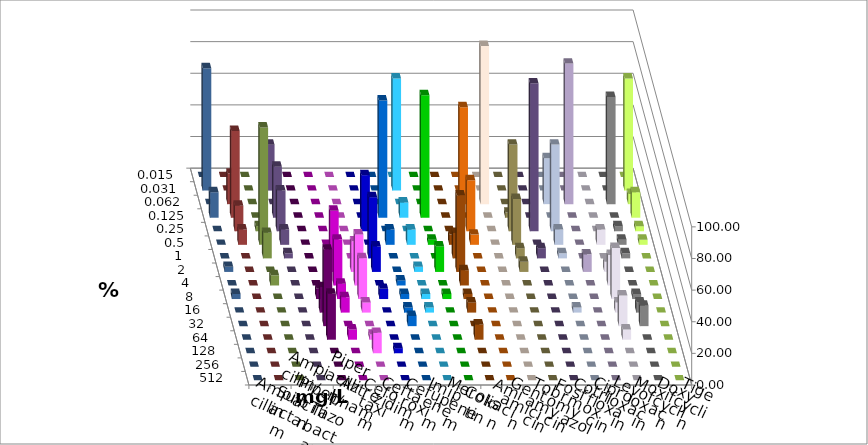
| Category | Ampicillin | Ampicillin/ Sulbactam | Piperacillin | Piperacillin/ Tazobactam | Aztreonam | Cefotaxim | Ceftazidim | Cefuroxim | Imipenem | Meropenem | Colistin | Amikacin | Gentamicin | Tobramycin | Fosfomycin | Cotrimoxazol | Ciprofloxacin | Levofloxacin | Moxifloxacin | Doxycyclin | Tigecyclin |
|---|---|---|---|---|---|---|---|---|---|---|---|---|---|---|---|---|---|---|---|---|---|
| 0.015 | 0 | 0 | 0 | 0 | 0 | 0 | 0 | 0 | 0 | 0 | 0 | 0 | 0 | 0 | 0 | 0 | 0 | 0 | 0 | 0 | 0 |
| 0.031 | 0 | 0 | 0 | 0 | 0 | 70.968 | 0 | 0 | 0 | 0 | 0 | 0 | 0 | 0 | 0 | 0 | 70.968 | 77.419 | 0 | 0 | 29.032 |
| 0.062 | 0 | 0 | 0 | 0 | 0 | 0 | 0 | 0 | 61.29 | 100 | 0 | 0 | 29.032 | 88.889 | 0 | 67.742 | 6.452 | 0 | 19.355 | 0 | 0 |
| 0.125 | 0 | 0 | 0 | 0 | 74.194 | 9.677 | 77.419 | 0 | 0 | 0 | 3.226 | 0 | 0 | 0 | 0 | 0 | 16.129 | 16.129 | 54.839 | 0 | 32.258 |
| 0.25 | 0 | 0 | 0 | 35.484 | 0 | 0 | 0 | 0 | 32.258 | 0 | 54.839 | 93.548 | 54.839 | 0 | 0 | 3.226 | 3.226 | 0 | 16.129 | 3.226 | 25.806 |
| 0.5 | 0 | 0 | 0 | 0 | 9.677 | 9.677 | 3.226 | 6.452 | 6.452 | 0 | 29.032 | 0 | 9.677 | 0 | 9.677 | 3.226 | 3.226 | 0 | 9.677 | 74.194 | 9.677 |
| 1.0 | 0 | 6.452 | 0 | 38.71 | 0 | 0 | 0 | 16.129 | 0 | 0 | 6.452 | 6.452 | 3.226 | 0 | 0 | 3.226 | 0 | 0 | 0 | 16.129 | 3.226 |
| 2.0 | 0 | 38.71 | 19.355 | 16.129 | 0 | 3.226 | 16.129 | 48.387 | 0 | 0 | 6.452 | 0 | 0 | 11.111 | 6.452 | 0 | 0 | 3.226 | 0 | 0 | 0 |
| 4.0 | 0 | 29.032 | 32.258 | 0 | 3.226 | 0 | 0 | 9.677 | 0 | 0 | 0 | 0 | 0 | 0 | 19.355 | 0 | 0 | 0 | 0 | 6.452 | 0 |
| 8.0 | 6.452 | 9.677 | 25.806 | 6.452 | 3.226 | 3.226 | 3.226 | 3.226 | 0 | 0 | 0 | 0 | 0 | 0 | 32.258 | 3.226 | 0 | 3.226 | 0 | 0 | 0 |
| 16.0 | 16.129 | 9.677 | 6.452 | 0 | 3.226 | 3.226 | 0 | 6.452 | 0 | 0 | 0 | 0 | 3.226 | 0 | 6.452 | 6.452 | 0 | 0 | 0 | 0 | 0 |
| 32.0 | 48.387 | 0 | 0 | 0 | 6.452 | 0 | 0 | 0 | 0 | 0 | 0 | 0 | 0 | 0 | 19.355 | 12.903 | 0 | 0 | 0 | 0 | 0 |
| 64.0 | 29.032 | 6.452 | 3.226 | 0 | 0 | 0 | 0 | 9.677 | 0 | 0 | 0 | 0 | 0 | 0 | 6.452 | 0 | 0 | 0 | 0 | 0 | 0 |
| 128.0 | 0 | 0 | 12.903 | 3.226 | 0 | 0 | 0 | 0 | 0 | 0 | 0 | 0 | 0 | 0 | 0 | 0 | 0 | 0 | 0 | 0 | 0 |
| 256.0 | 0 | 0 | 0 | 0 | 0 | 0 | 0 | 0 | 0 | 0 | 0 | 0 | 0 | 0 | 0 | 0 | 0 | 0 | 0 | 0 | 0 |
| 512.0 | 0 | 0 | 0 | 0 | 0 | 0 | 0 | 0 | 0 | 0 | 0 | 0 | 0 | 0 | 0 | 0 | 0 | 0 | 0 | 0 | 0 |